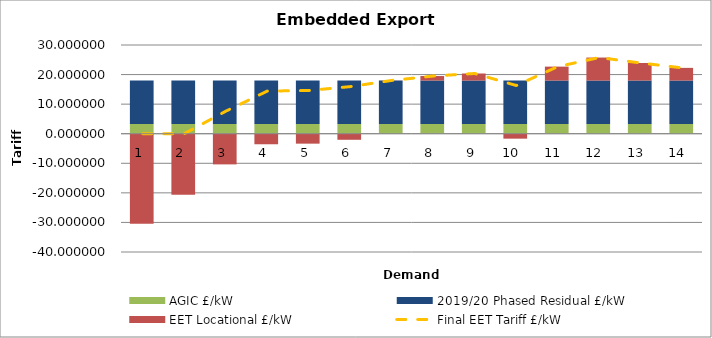
| Category | AGIC £/kW | 2019/20 Phased Residual £/kW  | EET Locational £/kW |
|---|---|---|---|
| 1.0 | 3.327 | 14.65 | -30.428 |
| 2.0 | 3.327 | 14.65 | -20.644 |
| 3.0 | 3.327 | 14.65 | -10.372 |
| 4.0 | 3.327 | 14.65 | -3.567 |
| 5.0 | 3.327 | 14.65 | -3.36 |
| 6.0 | 3.327 | 14.65 | -2.054 |
| 7.0 | 3.327 | 14.65 | 0.041 |
| 8.0 | 3.327 | 14.65 | 1.529 |
| 9.0 | 3.327 | 14.65 | 2.389 |
| 10.0 | 3.327 | 14.65 | -1.673 |
| 11.0 | 3.327 | 14.65 | 4.712 |
| 12.0 | 3.327 | 14.65 | 7.777 |
| 13.0 | 3.327 | 14.65 | 5.94 |
| 14.0 | 3.327 | 14.65 | 4.288 |